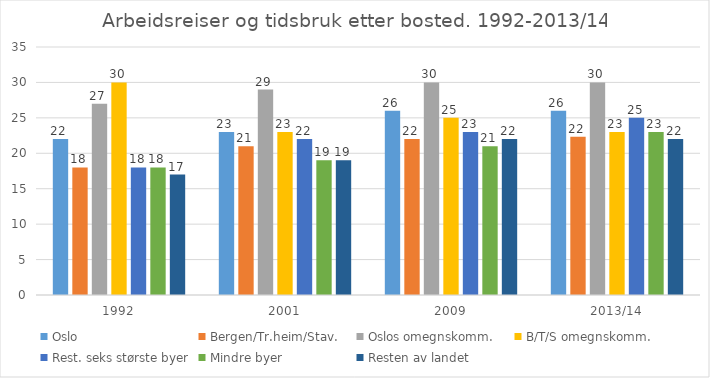
| Category | Oslo | Bergen/Tr.heim/Stav. | Oslos omegnskomm. | B/T/S omegnskomm. | Rest. seks største byer | Mindre byer | Resten av landet |
|---|---|---|---|---|---|---|---|
| 1992 | 22 | 18 | 27 | 30 | 18 | 18 | 17 |
| 2001 | 23 | 21 | 29 | 23 | 22 | 19 | 19 |
| 2009 | 26 | 22 | 30 | 25 | 23 | 21 | 22 |
| 2013/14 | 26 | 22.333 | 30 | 23 | 25 | 23 | 22 |